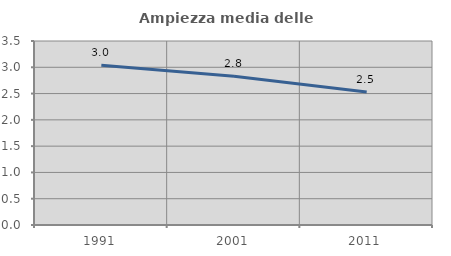
| Category | Ampiezza media delle famiglie |
|---|---|
| 1991.0 | 3.04 |
| 2001.0 | 2.83 |
| 2011.0 | 2.529 |